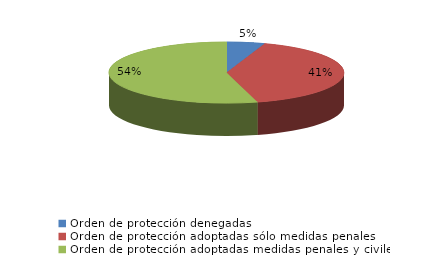
| Category | Series 0 |
|---|---|
| Orden de protección denegadas | 37 |
| Orden de protección adoptadas sólo medidas penales | 287 |
| Orden de protección adoptadas medidas penales y civiles | 384 |